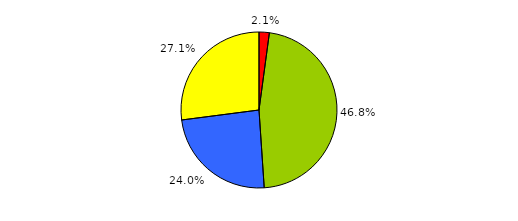
| Category | Series 0 |
|---|---|
| 0 | 12 |
| 1 | 263 |
| 2 | 135 |
| 3 | 152 |